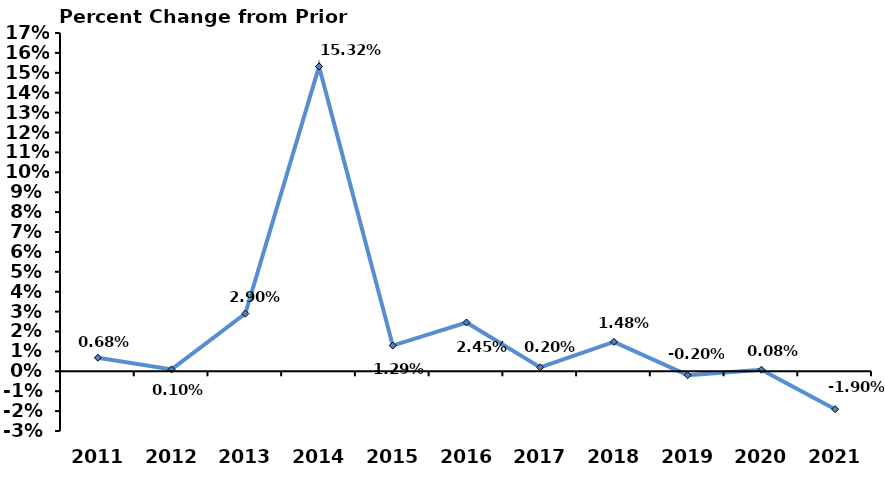
| Category | % Change from Prior Years |
|---|---|
| 2011.0 | 0.007 |
| 2012.0 | 0.001 |
| 2013.0 | 0.029 |
| 2014.0 | 0.153 |
| 2015.0 | 0.013 |
| 2016.0 | 0.025 |
| 2017.0 | 0.002 |
| 2018.0 | 0.015 |
| 2019.0 | -0.002 |
| 2020.0 | 0.001 |
| 2021.0 | -0.019 |